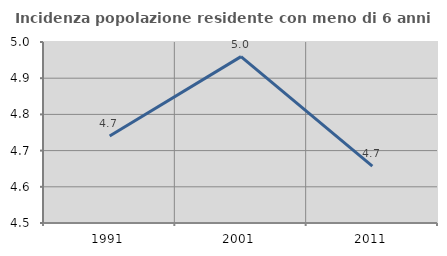
| Category | Incidenza popolazione residente con meno di 6 anni |
|---|---|
| 1991.0 | 4.741 |
| 2001.0 | 4.96 |
| 2011.0 | 4.657 |